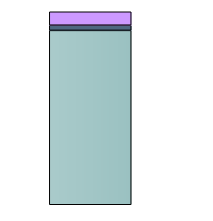
| Category | Series 0 | Series 1 | Series 2 |
|---|---|---|---|
| 0 | 665668.676 | 19745.146 | 51391.72 |